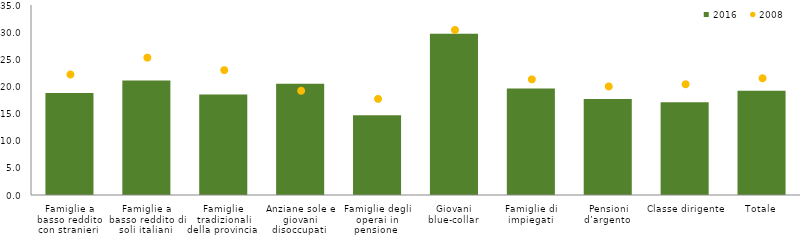
| Category | 2016 |
|---|---|
| Famiglie a basso reddito con stranieri  | 18.8 |
| Famiglie a basso reddito di soli italiani  | 21.1 |
| Famiglie tradizionali della provincia  | 18.5 |
| Anziane sole e giovani disoccupati  | 20.5 |
| Famiglie degli operai in pensione  | 14.7 |
| Giovani blue-collar  | 29.7 |
| Famiglie di impiegati  | 19.6 |
| Pensioni d’argento  | 17.7 |
| Classe dirigente  | 17.1 |
| Totale | 19.2 |